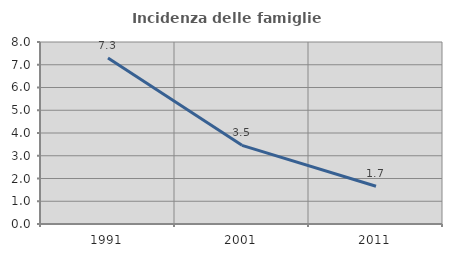
| Category | Incidenza delle famiglie numerose |
|---|---|
| 1991.0 | 7.298 |
| 2001.0 | 3.457 |
| 2011.0 | 1.662 |